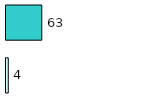
| Category | Series 0 | Series 1 |
|---|---|---|
| 0 | 4 | 63 |